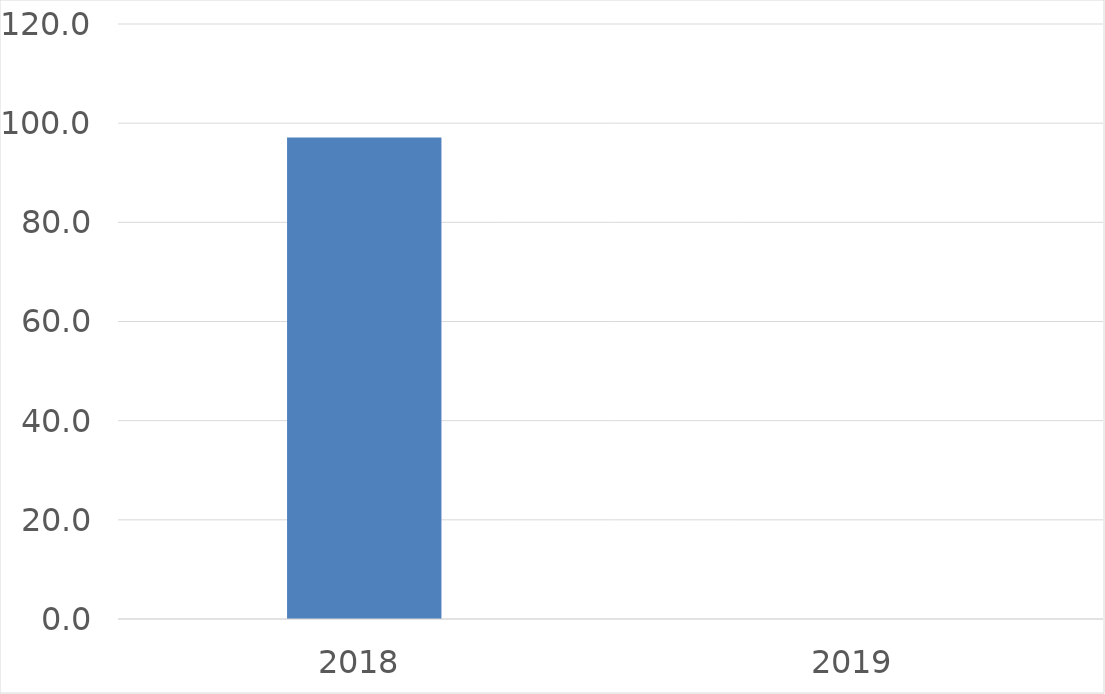
| Category | Series 0 |
|---|---|
| 2018 | 97.1 |
| 2019 | 0 |